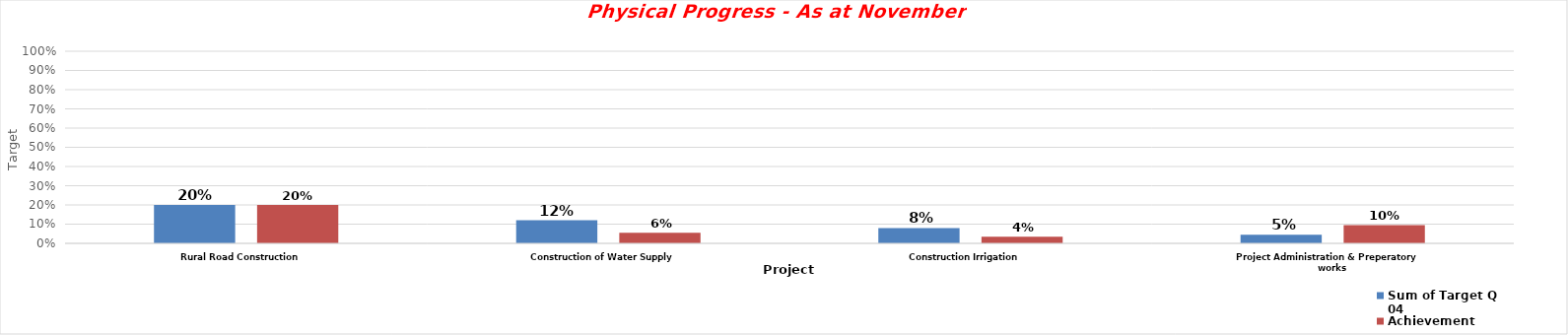
| Category | Sum of Target Q 04 | Achievement |
|---|---|---|
| Rural Road Construction | 0.2 | 0.199 |
| Construction of Water Supply | 0.12 | 0.056 |
| Construction Irrigation | 0.08 | 0.035 |
| Project Administration & Preperatory works | 0.045 | 0.095 |